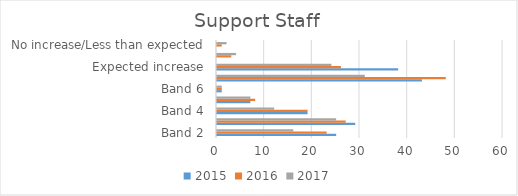
| Category | 2015 | 2016 | 2017 |
|---|---|---|---|
| Band 2 | 25 | 23 | 16 |
| Band 3 | 29 | 27 | 25 |
| Band 4 | 19 | 19 | 12 |
| Band 5 | 7 | 8 | 7 |
| Band 6 | 1 | 1 | 1 |
| Top of Scale | 43 | 48 | 31 |
| Expected increase | 38 | 26 | 24 |
| More than expected | 0 | 3 | 4 |
| No increase/Less than expected | 0 | 1 | 2 |